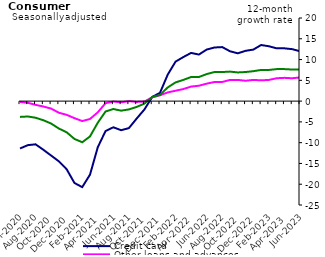
| Category | Credit card | Other loans and advances | Total |
|---|---|---|---|
| Jun-2020 | -11.4 | -0.2 | -3.8 |
| Jul-2020 | -10.6 | -0.4 | -3.7 |
| Aug-2020 | -10.4 | -0.9 | -4 |
| Sep-2020 | -11.7 | -1.3 | -4.6 |
| Oct-2020 | -13.1 | -1.8 | -5.4 |
| Nov-2020 | -14.5 | -2.8 | -6.6 |
| Dec-2020 | -16.4 | -3.3 | -7.5 |
| Jan-2021 | -19.7 | -4.1 | -9.1 |
| Feb-2021 | -20.7 | -4.8 | -9.9 |
| Mar-2021 | -17.7 | -4.3 | -8.5 |
| Apr-2021 | -11.1 | -2.7 | -5.2 |
| May-2021 | -7.2 | -0.5 | -2.5 |
| Jun-2021 | -6.3 | -0.1 | -1.9 |
| Jul-2021 | -7 | -0.3 | -2.3 |
| Aug-2021 | -6.5 | 0 | -2 |
| Sep-2021 | -4.2 | -0.2 | -1.4 |
| Oct-2021 | -2 | -0.1 | -0.6 |
| Nov-2021 | 1 | 0.9 | 1 |
| Dec-2021 | 2 | 1.4 | 1.5 |
| Jan-2022 | 6.4 | 2.1 | 3.3 |
| Feb-2022 | 9.5 | 2.5 | 4.5 |
| Mar-2022 | 10.6 | 2.9 | 5.1 |
| Apr-2022 | 11.6 | 3.5 | 5.8 |
| May-2022 | 11.2 | 3.7 | 5.8 |
| Jun-2022 | 12.4 | 4.2 | 6.5 |
| Jul-2022 | 12.9 | 4.6 | 7 |
| Aug-2022 | 13 | 4.6 | 7 |
| Sep-2022 | 12 | 5.1 | 7.1 |
| Oct-2022 | 11.5 | 5.1 | 6.9 |
| Nov-2022 | 12.1 | 4.9 | 7 |
| Dec-2022 | 12.4 | 5.1 | 7.2 |
| Jan-2023 | 13.5 | 5 | 7.5 |
| Feb-2023 | 13.2 | 5.1 | 7.5 |
| Mar-2023 | 12.7 | 5.5 | 7.7 |
| Apr-2023 | 12.7 | 5.6 | 7.7 |
| May-2023 | 12.5 | 5.5 | 7.6 |
| Jun-2023 | 12 | 5.7 | 7.6 |